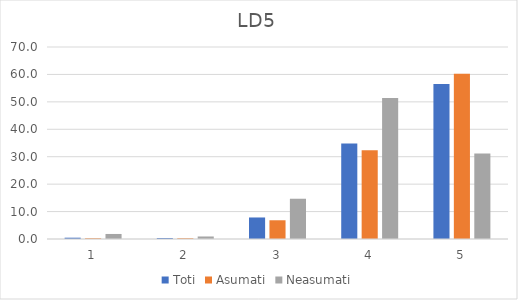
| Category | Toti | Asumati | Neasumati |
|---|---|---|---|
| 0 | 0.476 | 0.273 | 1.835 |
| 1 | 0.357 | 0.273 | 0.917 |
| 2 | 7.848 | 6.831 | 14.679 |
| 3 | 34.839 | 32.377 | 51.376 |
| 4 | 56.48 | 60.246 | 31.193 |